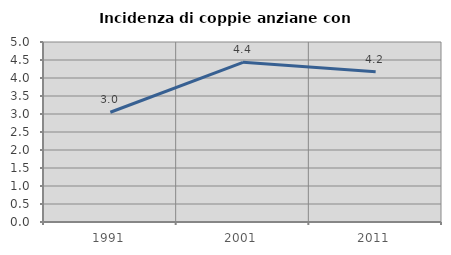
| Category | Incidenza di coppie anziane con figli |
|---|---|
| 1991.0 | 3.049 |
| 2001.0 | 4.435 |
| 2011.0 | 4.176 |